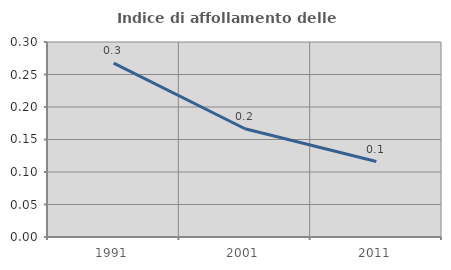
| Category | Indice di affollamento delle abitazioni  |
|---|---|
| 1991.0 | 0.267 |
| 2001.0 | 0.167 |
| 2011.0 | 0.116 |